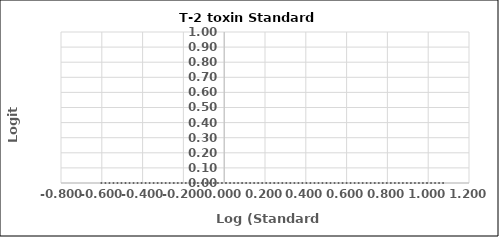
| Category | Series 0 |
|---|---|
| -0.6020599913279624 | 0 |
| 0.0 | 0 |
| 0.3010299956639812 | 0 |
| 0.7781512503836436 | 0 |
| 1.0791812460476249 | 0 |